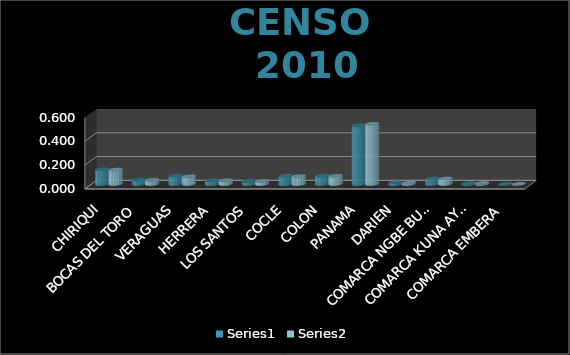
| Category | Series 0 | Series 1 |
|---|---|---|
| CHIRIQUI | 0.125 | 0.122 |
| BOCAS DEL TORO | 0.038 | 0.036 |
| VERAGUAS | 0.071 | 0.066 |
| HERRERA | 0.033 | 0.032 |
| LOS SANTOS | 0.027 | 0.026 |
| COCLE | 0.07 | 0.068 |
| COLON | 0.07 | 0.07 |
| PANAMA | 0.495 | 0.507 |
| DARIEN | 0.015 | 0.013 |
| COMARCA NGBE BUGLE | 0.046 | 0.047 |
| COMARCA KUNA AYALA | 0.009 | 0.01 |
| COMARCA EMBERA | 0.003 | 0.003 |